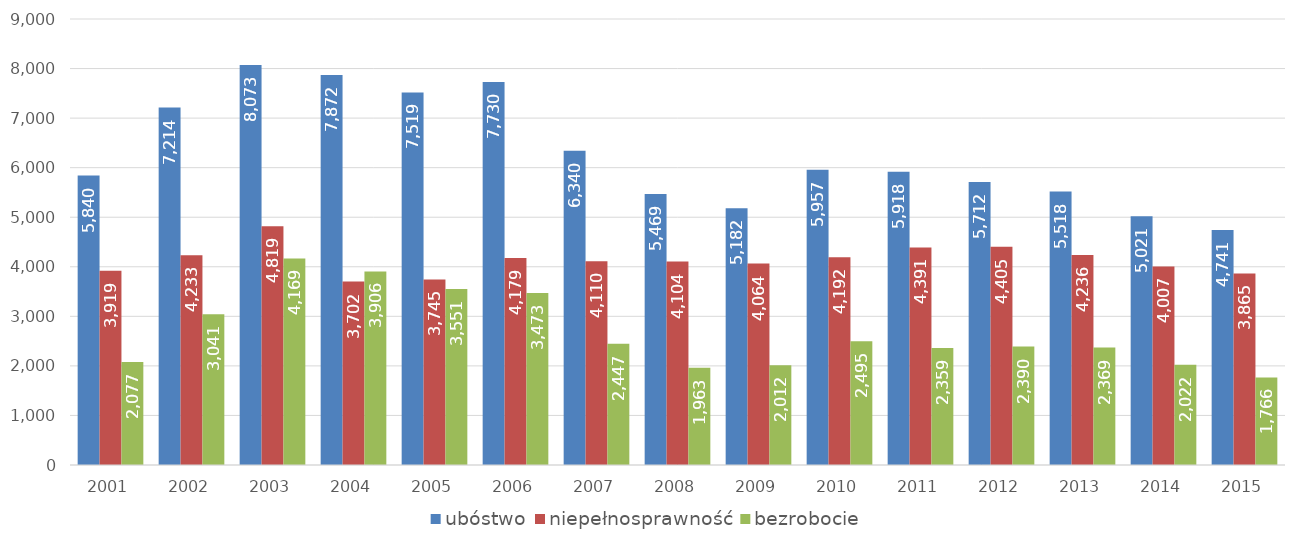
| Category | ubóstwo | niepełnosprawność | bezrobocie |
|---|---|---|---|
| 2001.0 | 5840 | 3919 | 2077 |
| 2002.0 | 7214 | 4233 | 3041 |
| 2003.0 | 8073 | 4819 | 4169 |
| 2004.0 | 7872 | 3702 | 3906 |
| 2005.0 | 7519 | 3745 | 3551 |
| 2006.0 | 7730 | 4179 | 3473 |
| 2007.0 | 6340 | 4110 | 2447 |
| 2008.0 | 5469 | 4104 | 1963 |
| 2009.0 | 5182 | 4064 | 2012 |
| 2010.0 | 5957 | 4192 | 2495 |
| 2011.0 | 5918 | 4391 | 2359 |
| 2012.0 | 5712 | 4405 | 2390 |
| 2013.0 | 5518 | 4236 | 2369 |
| 2014.0 | 5021 | 4007 | 2022 |
| 2015.0 | 4741 | 3865 | 1766 |